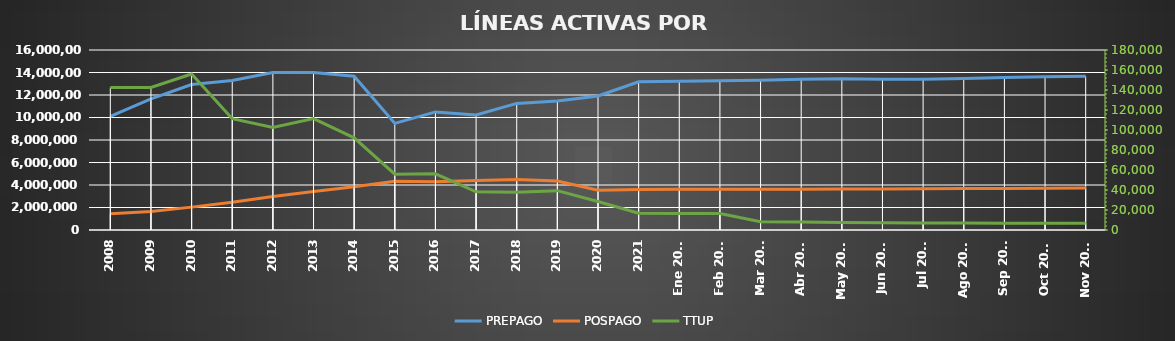
| Category | PREPAGO | POSPAGO |
|---|---|---|
| 2008 | 10097768 | 1452088 |
| 2009 | 11662294 | 1649838 |
| 2010 | 12929040 | 2033814 |
| 2011 | 13295834 | 2467378 |
| 2012 | 14008104 | 2976194 |
| 2013 | 14005126 | 3425277 |
| 2014 | 13666071 | 3846271 |
| 2015 | 9476240 | 4326937 |
| 2016 | 10498467 | 4293426 |
| 2017 | 10219457 | 4393703 |
| 2018 | 11254168 | 4480975 |
| 2019 | 11462048 | 4351686 |
| 2020 | 11917697 | 3539192 |
| 2021 | 13174530 | 3598383 |
| Ene 2022 | 13220510 | 3611202 |
| Feb 2022 | 13277237 | 3612124 |
| Mar 2022 | 13319621 | 3621700 |
| Abr 2022 | 13391496 | 3628201 |
| May 2022 | 13434704 | 3642700 |
| Jun 2022 | 13396249 | 3652440 |
| Jul 2022 | 13410009 | 3668962 |
| Ago 2022 | 13466342 | 3682408 |
| Sep 2022 | 13550174 | 3696591 |
| Oct 2022 | 13621140 | 3709853 |
| Nov 2022 | 13659038 | 3726103 |